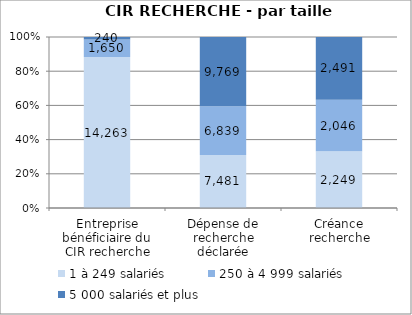
| Category | 1 à 249 salariés | 250 à 4 999 salariés | 5 000 salariés et plus |
|---|---|---|---|
| Entreprise bénéficiaire du CIR recherche | 14263 | 1650 | 240 |
| Dépense de recherche déclarée | 7481.01 | 6838.62 | 9769.11 |
| Créance recherche | 2248.62 | 2045.61 | 2491.1 |